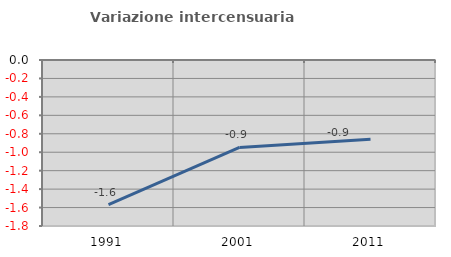
| Category | Variazione intercensuaria annua |
|---|---|
| 1991.0 | -1.569 |
| 2001.0 | -0.949 |
| 2011.0 | -0.86 |